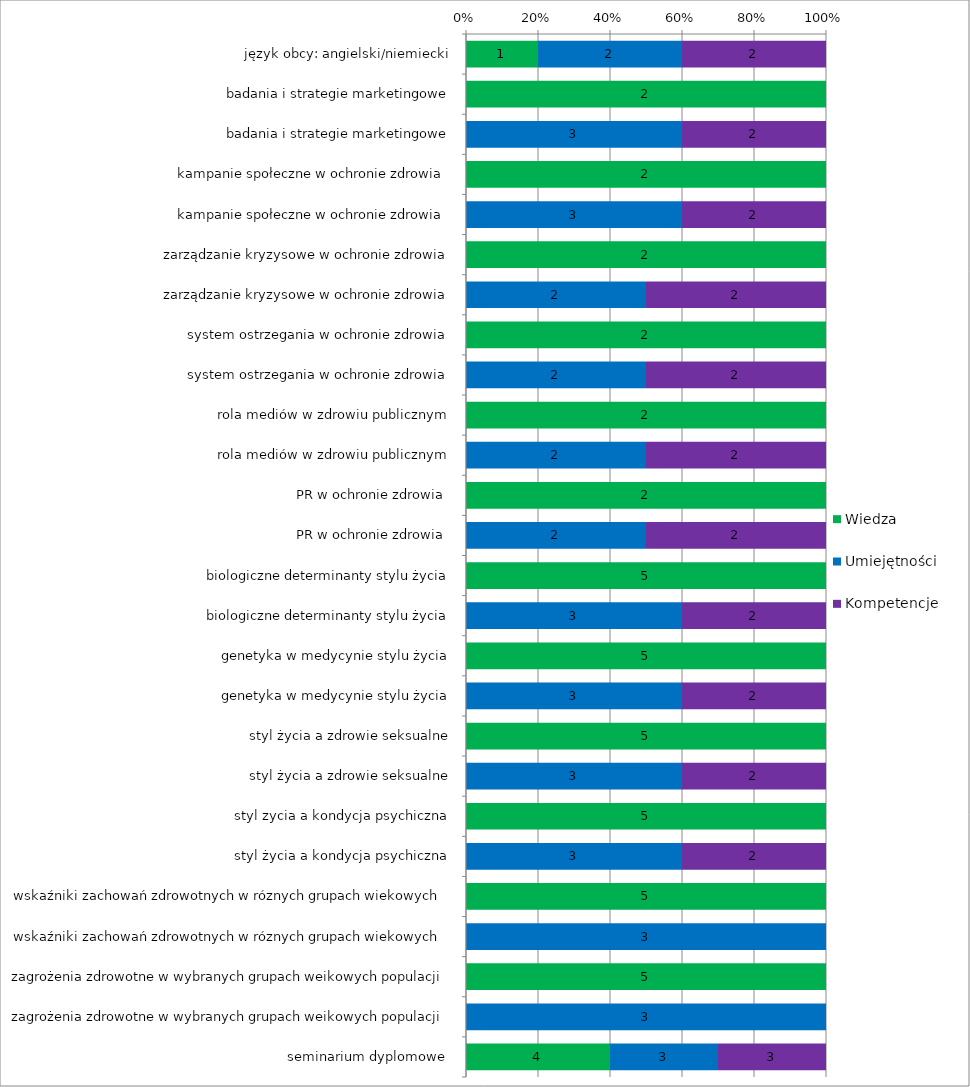
| Category | Wiedza | Umiejętności | Kompetencje |
|---|---|---|---|
| język obcy: angielski/niemiecki | 1 | 2 | 2 |
| badania i strategie marketingowe | 2 | 0 | 0 |
| badania i strategie marketingowe | 0 | 3 | 2 |
| kampanie społeczne w ochronie zdrowia  | 2 | 0 | 0 |
| kampanie społeczne w ochronie zdrowia  | 0 | 3 | 2 |
| zarządzanie kryzysowe w ochronie zdrowia | 2 | 0 | 0 |
| zarządzanie kryzysowe w ochronie zdrowia | 0 | 2 | 2 |
| system ostrzegania w ochronie zdrowia | 2 | 0 | 0 |
| system ostrzegania w ochronie zdrowia | 0 | 2 | 2 |
| rola mediów w zdrowiu publicznym | 2 | 0 | 0 |
| rola mediów w zdrowiu publicznym | 0 | 2 | 2 |
| PR w ochronie zdrowia  | 2 | 0 | 0 |
| PR w ochronie zdrowia  | 0 | 2 | 2 |
| biologiczne determinanty stylu życia | 5 | 0 | 0 |
| biologiczne determinanty stylu życia | 0 | 3 | 2 |
| genetyka w medycynie stylu życia | 5 | 0 | 0 |
| genetyka w medycynie stylu życia | 0 | 3 | 2 |
| styl życia a zdrowie seksualne | 5 | 0 | 0 |
| styl życia a zdrowie seksualne | 0 | 3 | 2 |
| styl zycia a kondycja psychiczna | 5 | 0 | 0 |
| styl życia a kondycja psychiczna | 0 | 3 | 2 |
| wskaźniki zachowań zdrowotnych w róznych grupach wiekowych  | 5 | 0 | 0 |
| wskaźniki zachowań zdrowotnych w róznych grupach wiekowych  | 0 | 3 | 0 |
| zagrożenia zdrowotne w wybranych grupach weikowych populacji | 5 | 0 | 0 |
| zagrożenia zdrowotne w wybranych grupach weikowych populacji | 0 | 3 | 0 |
| seminarium dyplomowe  | 4 | 3 | 3 |